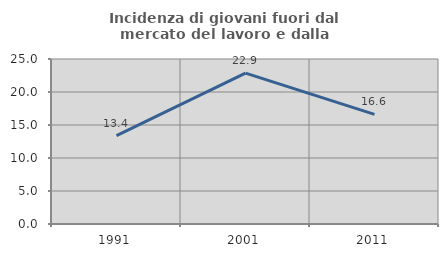
| Category | Incidenza di giovani fuori dal mercato del lavoro e dalla formazione  |
|---|---|
| 1991.0 | 13.386 |
| 2001.0 | 22.852 |
| 2011.0 | 16.612 |